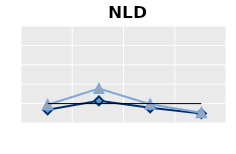
| Category | Public goods | Individual items only | Series 1 |
|---|---|---|---|
| 15-24 | 0.68 | 0.941 | 1 |
| 25-54 | 1.144 | 1.772 | 1 |
| 55-64 | 0.781 | 0.963 | 1 |
| 65+ | 0.486 | 0.532 | 1 |